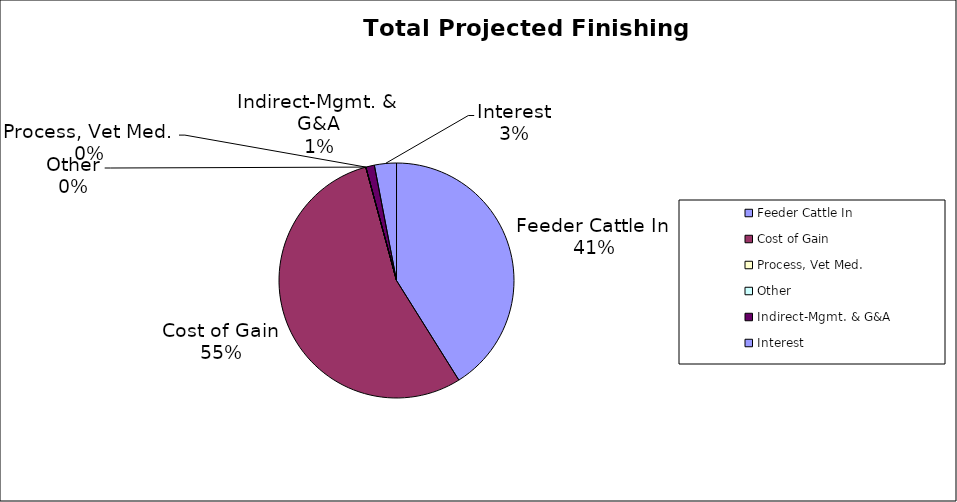
| Category | Total |
|---|---|
| Feeder Cattle In | 69326.122 |
| Cost of Gain | 92256 |
| Process, Vet Med. | 0 |
| Other | 0 |
| Indirect-Mgmt. & G&A | 2000 |
| Interest | 5106.784 |